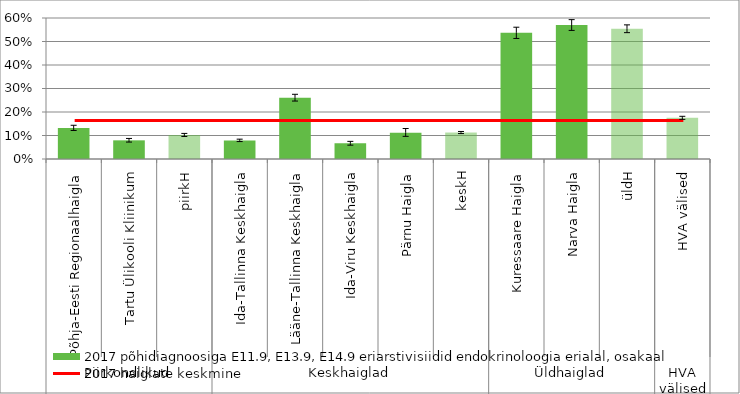
| Category | 2017 põhidiagnoosiga E11.9, E13.9, E14.9 eriarstivisiidid endokrinoloogia erialal, osakaal |
|---|---|
| 0 | 0.132 |
| 1 | 0.079 |
| 2 | 0.102 |
| 3 | 0.079 |
| 4 | 0.261 |
| 5 | 0.067 |
| 6 | 0.112 |
| 7 | 0.113 |
| 8 | 0.537 |
| 9 | 0.57 |
| 10 | 0.554 |
| 11 | 0.175 |